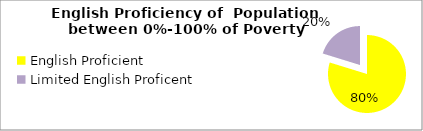
| Category | Percent |
|---|---|
| English Proficient | 0.798 |
| Limited English Proficent | 0.202 |